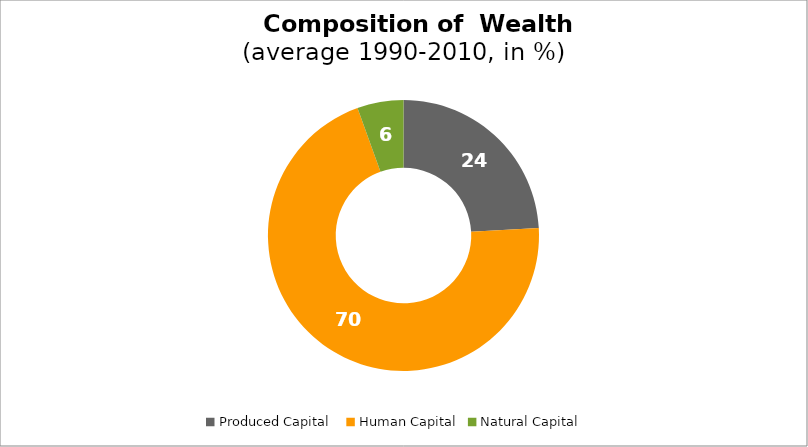
| Category | Series 0 |
|---|---|
| Produced Capital  | 24.113 |
| Human Capital | 70.375 |
| Natural Capital | 5.512 |